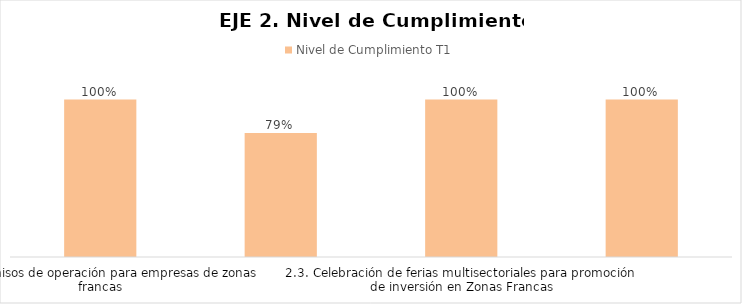
| Category | Nivel de Cumplimiento T1 |
|---|---|
| 2.1. Permisos de operación para empresas de zonas francas | 1 |
| 2.2. Estudio de inteligencia comercial para la inserción de los subsectores productivos de zonas francas | 0.787 |
| 2.3. Celebración de ferias multisectoriales para promoción de inversión en Zonas Francas | 1 |
| 2.4. Creación de clústeres de exportación de bienes y servicios | 1 |